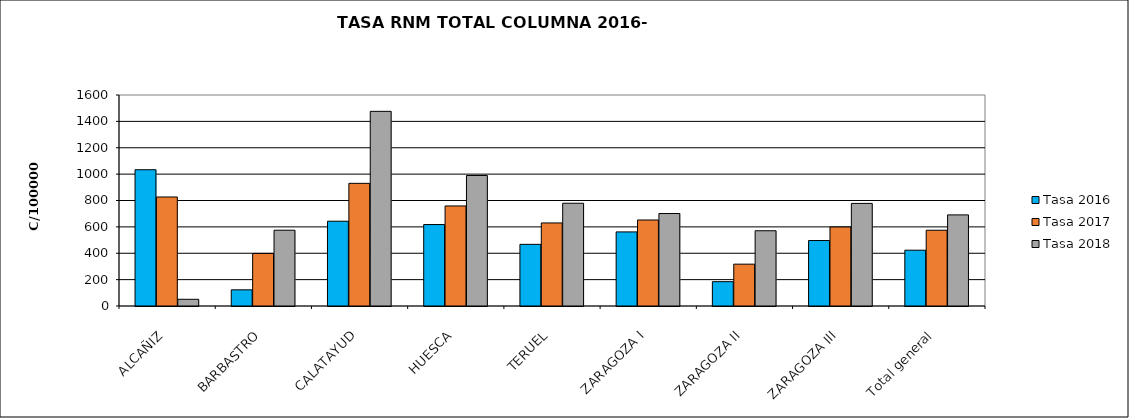
| Category | Tasa 2016 | Tasa 2017 | Tasa 2018 |
|---|---|---|---|
| ALCAÑIZ | 1033.36 | 826.636 | 50.906 |
| BARBASTRO | 122.586 | 398.55 | 574.658 |
| CALATAYUD | 642.875 | 930.141 | 1476.088 |
| HUESCA | 617.761 | 758.694 | 989.582 |
| TERUEL | 467.564 | 629.828 | 779.225 |
| ZARAGOZA I | 561.945 | 652.14 | 701.283 |
| ZARAGOZA II | 184.452 | 317.276 | 570.654 |
| ZARAGOZA III | 496.451 | 599.301 | 777.849 |
| Total general | 423.13 | 574.489 | 690.882 |